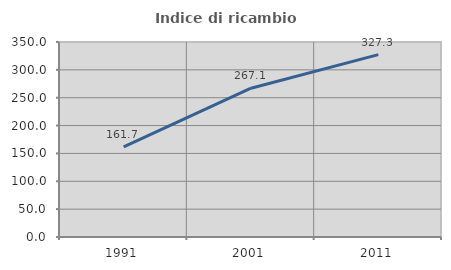
| Category | Indice di ricambio occupazionale  |
|---|---|
| 1991.0 | 161.749 |
| 2001.0 | 267.114 |
| 2011.0 | 327.273 |